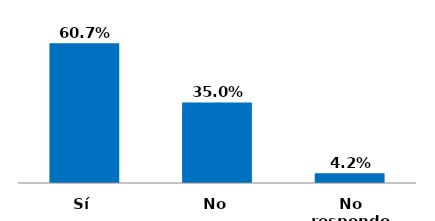
| Category | Series 0 |
|---|---|
| Sí | 0.607 |
| No | 0.35 |
| No responde | 0.042 |